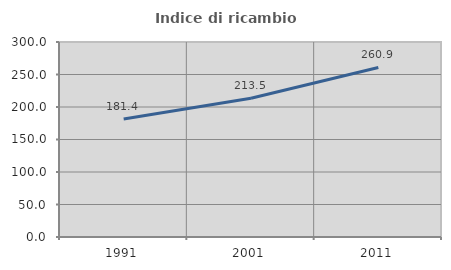
| Category | Indice di ricambio occupazionale  |
|---|---|
| 1991.0 | 181.395 |
| 2001.0 | 213.462 |
| 2011.0 | 260.87 |